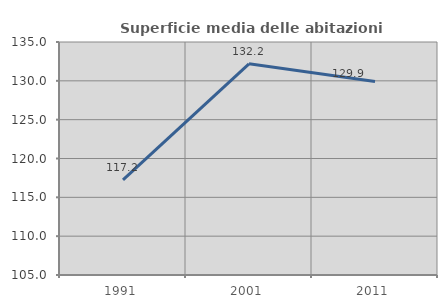
| Category | Superficie media delle abitazioni occupate |
|---|---|
| 1991.0 | 117.238 |
| 2001.0 | 132.185 |
| 2011.0 | 129.926 |